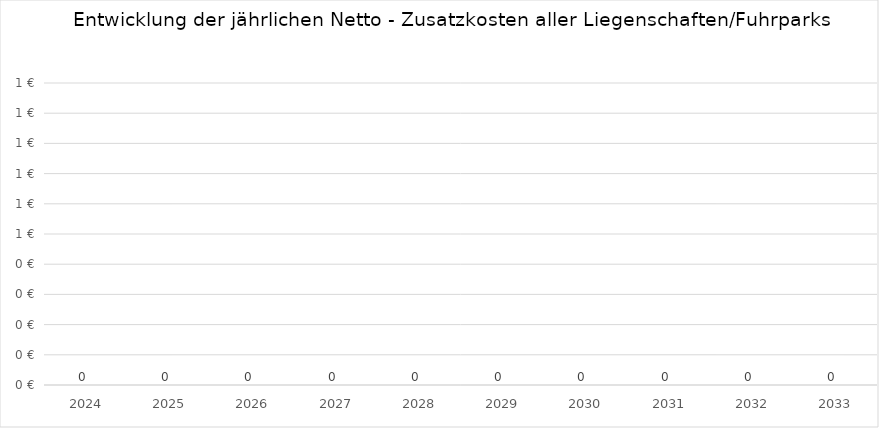
| Category | Series 0 |
|---|---|
| 2024
 | 0 |
| 2025
 | 0 |
| 2026
 | 0 |
| 2027
 | 0 |
| 2028
 | 0 |
| 2029
 | 0 |
| 2030
 | 0 |
| 2031
 | 0 |
| 2032
 | 0 |
| 2033
 | 0 |